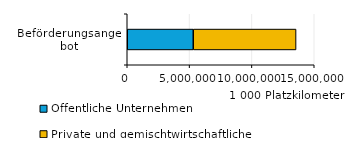
| Category | Öffentliche Unternehmen | Private und gemischtwirtschaftliche Unternehmen |
|---|---|---|
| 0 | 5294733 | 8246840 |